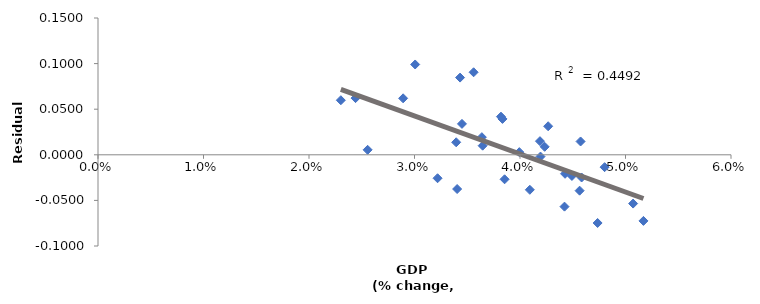
| Category | Series 0 |
|---|---|
| 0.039936180144779065 | 0.003 |
| 0.0457410733479886 | 0.015 |
| 0.04189226141646163 | 0.015 |
| 0.03833874495632217 | 0.039 |
| 0.03819483991129635 | 0.042 |
| 0.03395247979098004 | 0.014 |
| 0.036461340612041315 | 0.01 |
| 0.048018422326603805 | -0.014 |
| 0.04233941224300142 | 0.009 |
| 0.04266959126212977 | 0.031 |
| 0.03560282341024901 | 0.09 |
| 0.03432002896415676 | 0.085 |
| 0.030063829918959062 | 0.099 |
| 0.03638387914277974 | 0.019 |
| 0.04426948022177535 | -0.021 |
| 0.032185448049440124 | -0.026 |
| 0.04735573600033649 | -0.075 |
| 0.05170131820259116 | -0.072 |
| 0.04421914055411502 | -0.057 |
| 0.050722392108940584 | -0.053 |
| 0.04565070183291442 | -0.039 |
| 0.03449813203309282 | 0.034 |
| 0.02892059309919559 | 0.062 |
| 0.02441236700351679 | 0.062 |
| 0.023017018544231327 | 0.06 |
| 0.02555765884207717 | 0.005 |
| 0.03404088392973881 | -0.038 |
| 0.04093084398476843 | -0.038 |
| 0.038539325239931754 | -0.027 |
| 0.04194238175280329 | -0.002 |
| 0.044922862923621576 | -0.023 |
| 0.04583929111915919 | -0.025 |